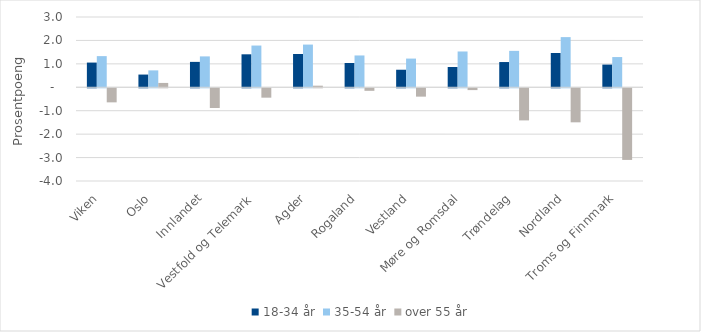
| Category | 18-34 år | 35-54 år | over 55 år |
|---|---|---|---|
| Viken | 1.055 | 1.33 | -0.6 |
| Oslo | 0.543 | 0.722 | 0.186 |
| Innlandet | 1.084 | 1.319 | -0.841 |
| Vestfold og Telemark | 1.408 | 1.782 | -0.401 |
| Agder | 1.422 | 1.823 | 0.068 |
| Rogaland | 1.038 | 1.358 | -0.109 |
| Vestland | 0.749 | 1.225 | -0.357 |
| Møre og Romsdal | 0.867 | 1.528 | -0.077 |
| Trøndelag | 1.078 | 1.554 | -1.371 |
| Nordland | 1.463 | 2.142 | -1.453 |
| Troms og Finnmark | 0.969 | 1.29 | -3.057 |